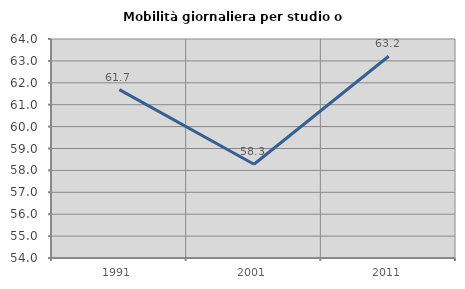
| Category | Mobilità giornaliera per studio o lavoro |
|---|---|
| 1991.0 | 61.688 |
| 2001.0 | 58.28 |
| 2011.0 | 63.212 |